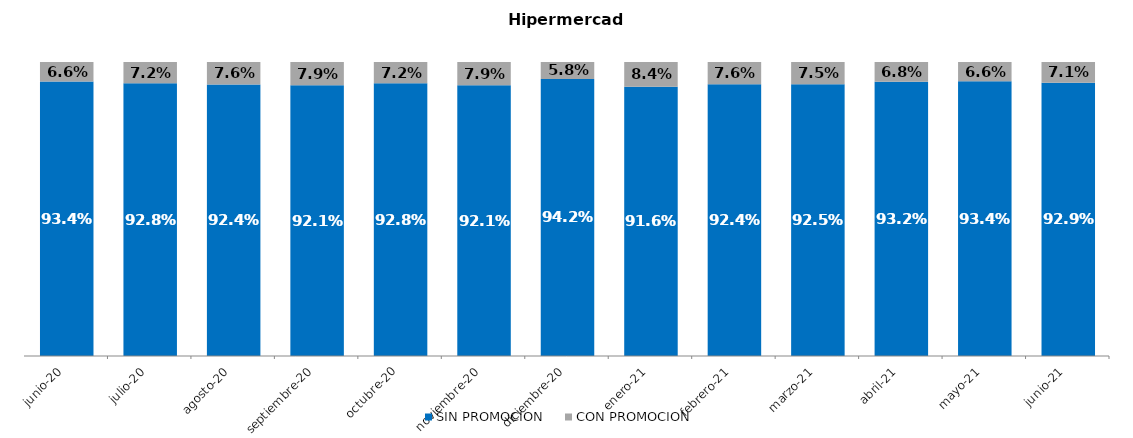
| Category | SIN PROMOCION   | CON PROMOCION   |
|---|---|---|
| 2020-06-01 | 0.934 | 0.066 |
| 2020-07-01 | 0.928 | 0.072 |
| 2020-08-01 | 0.924 | 0.076 |
| 2020-09-01 | 0.921 | 0.079 |
| 2020-10-01 | 0.928 | 0.072 |
| 2020-11-01 | 0.921 | 0.079 |
| 2020-12-01 | 0.942 | 0.058 |
| 2021-01-01 | 0.916 | 0.084 |
| 2021-02-01 | 0.924 | 0.076 |
| 2021-03-01 | 0.925 | 0.075 |
| 2021-04-01 | 0.932 | 0.068 |
| 2021-05-01 | 0.934 | 0.066 |
| 2021-06-01 | 0.929 | 0.071 |